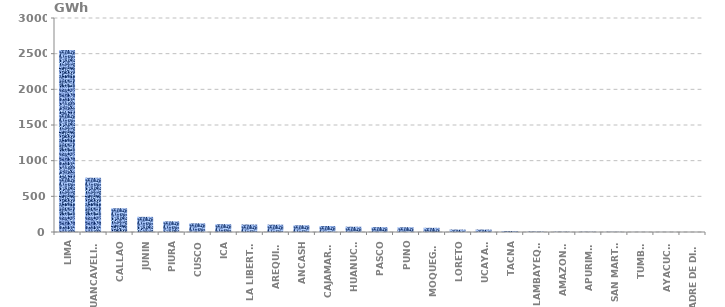
| Category | Series 0 |
|---|---|
| LIMA | 2552.225 |
| HUANCAVELICA | 760.354 |
| CALLAO | 333.068 |
| JUNIN | 212.351 |
| PIURA | 149.391 |
| CUSCO | 121.222 |
| ICA | 109.565 |
| LA LIBERTAD | 104.774 |
| AREQUIPA | 102.983 |
| ANCASH | 94.11 |
| CAJAMARCA | 83.982 |
| HUANUCO | 73.997 |
| PASCO | 68.783 |
| PUNO | 66.813 |
| MOQUEGUA | 58.799 |
| LORETO | 34.188 |
| UCAYALI | 34.176 |
| TACNA | 13.748 |
| LAMBAYEQUE | 6.744 |
| AMAZONAS | 4.55 |
| APURIMAC | 3.819 |
| SAN MARTÍN | 2.93 |
| TUMBES | 1.101 |
| AYACUCHO | 0.838 |
| MADRE DE DIOS | 0.17 |